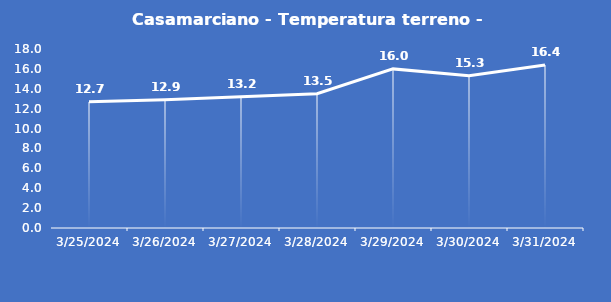
| Category | Casamarciano - Temperatura terreno - Grezzo (°C) |
|---|---|
| 3/25/24 | 12.7 |
| 3/26/24 | 12.9 |
| 3/27/24 | 13.2 |
| 3/28/24 | 13.5 |
| 3/29/24 | 16 |
| 3/30/24 | 15.3 |
| 3/31/24 | 16.4 |